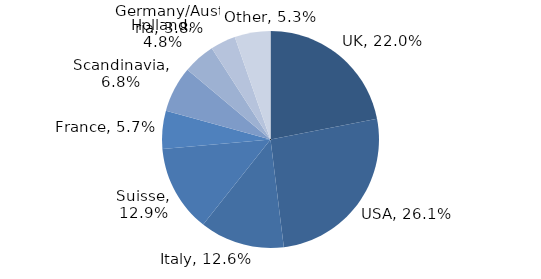
| Category | Investment Style |
|---|---|
| UK | 0.22 |
| USA | 0.261 |
| Italy | 0.126 |
| Suisse | 0.129 |
| France | 0.057 |
| Scandinavia | 0.068 |
| Holland | 0.048 |
| Germany/Austria | 0.038 |
| Other | 0.053 |